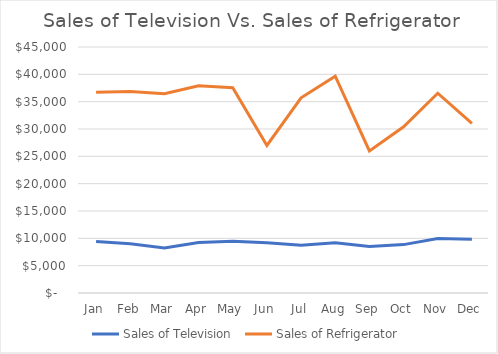
| Category | Sales of Television | Sales of Refrigerator |
|---|---|---|
| Jan | 9420 | 36700 |
| Feb | 9000 | 36850 |
| Mar | 8250 | 36450 |
| Apr | 9250 | 37900 |
| May | 9470 | 37550 |
| Jun | 9200 | 27000 |
| Jul | 8750 | 35700 |
| Aug | 9200 | 39650 |
| Sep | 8500 | 26000 |
| Oct | 8850 | 30400 |
| Nov | 9950 | 36550 |
| Dec | 9850 | 31050 |